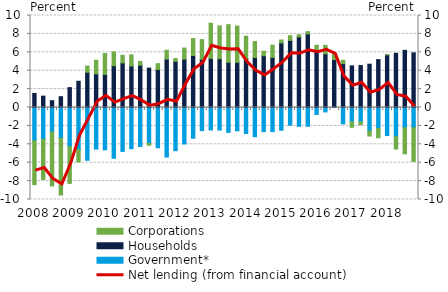
| Category | Government* | Households | Corporations |
|---|---|---|---|
| 2008.0 | -3.614 | 1.526 | -4.77 |
| nan | -3.465 | 1.235 | -4.353 |
| nan | -2.667 | 0.739 | -5.861 |
| nan | -3.365 | 1.174 | -6.149 |
| 2009.0 | -4.26 | 2.16 | -3.987 |
| nan | -4.568 | 2.85 | -1.346 |
| nan | -5.737 | 3.828 | 0.678 |
| nan | -4.523 | 3.656 | 1.48 |
| 2010.0 | -4.596 | 3.6 | 2.266 |
| nan | -5.515 | 4.545 | 1.5 |
| nan | -4.769 | 4.842 | 0.832 |
| nan | -4.478 | 4.507 | 1.208 |
| 2011.0 | -4.232 | 4.596 | 0.413 |
| nan | -3.914 | 4.279 | -0.187 |
| nan | -4.378 | 4.137 | 0.626 |
| nan | -5.386 | 5.263 | 0.962 |
| 2012.0 | -4.694 | 5.019 | 0.303 |
| nan | -3.959 | 5.257 | 1.203 |
| nan | -3.339 | 5.653 | 1.84 |
| nan | -2.511 | 5.231 | 2.147 |
| 2013.0 | -2.438 | 5.341 | 3.812 |
| nan | -2.452 | 5.303 | 3.569 |
| nan | -2.704 | 4.913 | 4.093 |
| nan | -2.534 | 4.912 | 3.942 |
| 2014.0 | -2.818 | 5.3 | 2.454 |
| nan | -3.173 | 5.431 | 1.734 |
| nan | -2.623 | 5.628 | 0.485 |
| nan | -2.614 | 5.443 | 1.332 |
| 2015.0 | -2.474 | 7.012 | 0.329 |
| nan | -1.926 | 7.294 | 0.514 |
| nan | -2.045 | 7.68 | 0.226 |
| nan | -2.032 | 7.997 | 0.251 |
| 2016.0 | -0.754 | 6.134 | 0.629 |
| nan | -0.479 | 5.834 | 0.916 |
| nan | 0.035 | 5.168 | 0.627 |
| nan | -1.777 | 4.77 | 0.362 |
| 2017.0 | -1.56 | 4.522 | -0.589 |
| nan | -1.572 | 4.558 | -0.292 |
| nan | -2.559 | 4.707 | -0.538 |
| nan | -2.279 | 5.205 | -1.013 |
| 2018.0 | -3.051 | 5.711 | 0.025 |
| nan | -3.169 | 5.891 | -1.346 |
| nan | -2.205 | 6.21 | -2.831 |
| nan | -2.199 | 5.942 | -3.661 |